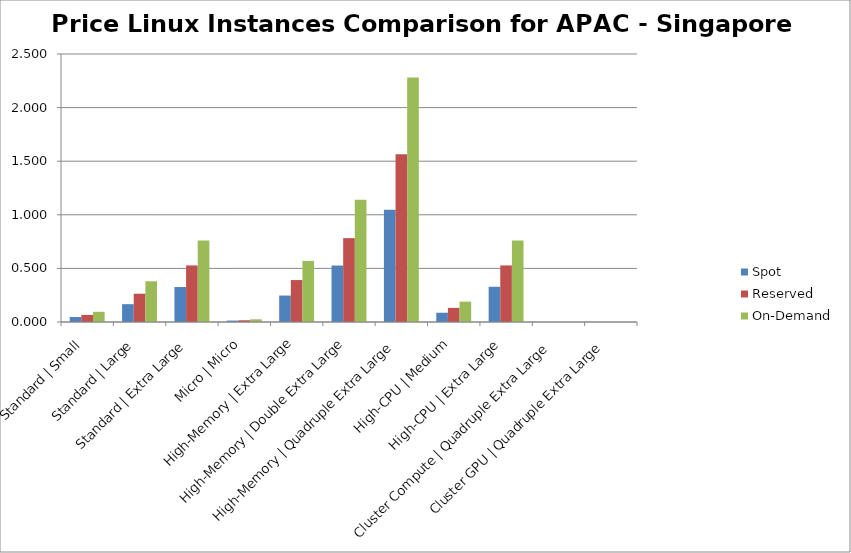
| Category | Spot | Reserved | On-Demand |
|---|---|---|---|
| Standard | Small | 0.047 | 0.066 | 0.095 |
| Standard | Large | 0.166 | 0.264 | 0.38 |
| Standard | Extra Large | 0.326 | 0.528 | 0.76 |
| Micro | Micro | 0.013 | 0.016 | 0.025 |
| High-Memory | Extra Large | 0.247 | 0.391 | 0.57 |
| High-Memory | Double Extra Large | 0.527 | 0.783 | 1.14 |
| High-Memory | Quadruple Extra Large | 1.048 | 1.565 | 2.28 |
| High-CPU | Medium | 0.086 | 0.132 | 0.19 |
| High-CPU | Extra Large | 0.329 | 0.528 | 0.76 |
| Cluster Compute | Quadruple Extra Large | 0 | 0 | 0 |
| Cluster GPU | Quadruple Extra Large | 0 | 0 | 0 |